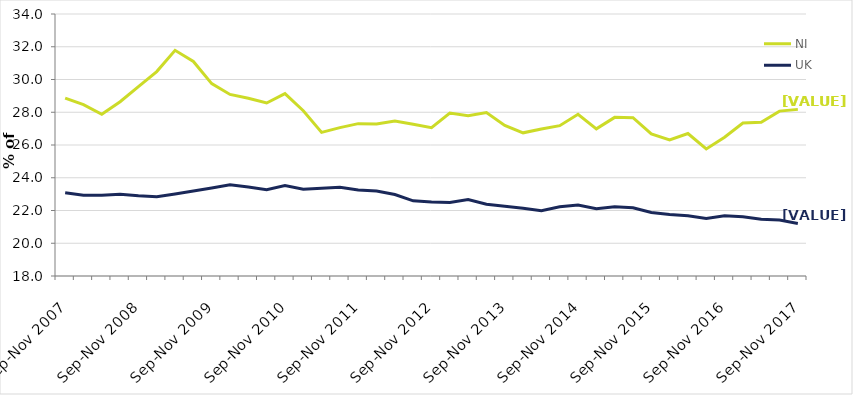
| Category | NI | UK |
|---|---|---|
| Sep-Nov 2007 | 28.863 | 23.08 |
| Dec-Feb 2008 | 28.464 | 22.927 |
| Mar-May 2008 | 27.876 | 22.927 |
| Jun-Aug 2008 | 28.643 | 22.988 |
| Sep-Nov 2008 | 29.57 | 22.895 |
| Dec-Feb 2009 | 30.485 | 22.838 |
| Mar-May 2009 | 31.781 | 23.012 |
| Jun-Aug 2009 | 31.102 | 23.19 |
| Sep-Nov 2009 | 29.75 | 23.371 |
| Dec-Feb 2010 | 29.087 | 23.57 |
| Mar-May 2010 | 28.851 | 23.429 |
| Jun-Aug 2010 | 28.566 | 23.27 |
| Sep-Nov 2010 | 29.138 | 23.518 |
| Dec-Feb 2011 | 28.094 | 23.297 |
| Mar-May 2011 | 26.772 | 23.362 |
| Jun-Aug 2011 | 27.061 | 23.421 |
| Sep-Nov 2011 | 27.303 | 23.254 |
| Dec-Feb 2012 | 27.277 | 23.187 |
| Mar-May 2012 | 27.468 | 22.976 |
| Jun-Aug 2012 | 27.27 | 22.589 |
| Sep-Nov 2012 | 27.059 | 22.518 |
| Dec-Feb 2013 | 27.949 | 22.496 |
| Mar-May 2013 | 27.782 | 22.665 |
| Jun-Aug 2013 | 27.979 | 22.382 |
| Sep-Nov 2013 | 27.198 | 22.26 |
| Dec-Feb 2014 | 26.743 | 22.143 |
| Mar-May 2014 | 26.98 | 21.987 |
| Jun-Aug 2014 | 27.18 | 22.234 |
| Sep-Nov 2014 | 27.873 | 22.337 |
| Dec-Feb 2015 | 26.987 | 22.102 |
| Mar-May 2015 | 27.687 | 22.225 |
| Jun-Aug 2015 | 27.669 | 22.17 |
| Sep-Nov 2015 | 26.676 | 21.874 |
| Dec-Feb 2016 | 26.315 | 21.754 |
| Mar-May 2016 | 26.702 | 21.675 |
| Jun-Aug 2016 | 25.761 | 21.511 |
| Sep-Nov 2016 | 26.475 | 21.678 |
| Dec-Feb 2017 | 27.347 | 21.624 |
| Mar-May 2017 | 27.387 | 21.469 |
| Jun-Aug 2017 | 28.07 | 21.413 |
| Sep-Nov 2017 | 28.176 | 21.209 |